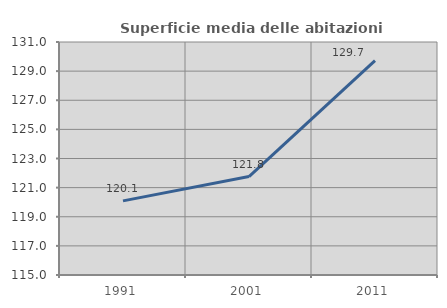
| Category | Superficie media delle abitazioni occupate |
|---|---|
| 1991.0 | 120.089 |
| 2001.0 | 121.758 |
| 2011.0 | 129.727 |